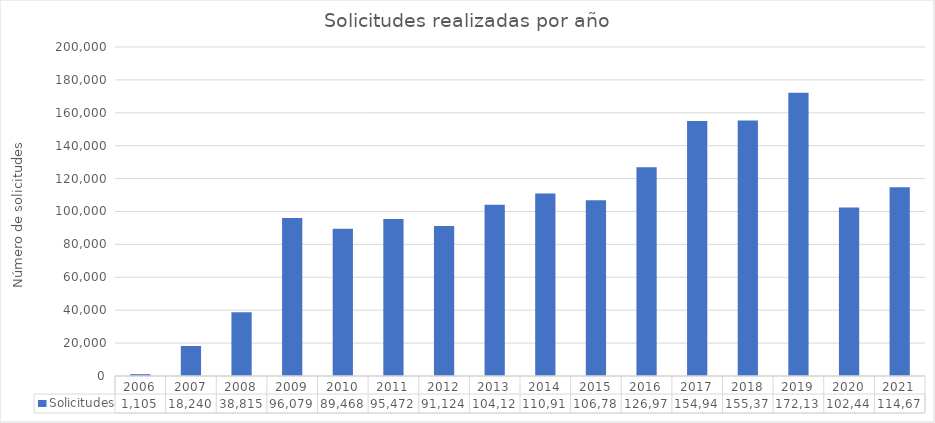
| Category | Solicitudes |
|---|---|
| 2006.0 | 1105 |
| 2007.0 | 18240 |
| 2008.0 | 38815 |
| 2009.0 | 96079 |
| 2010.0 | 89468 |
| 2011.0 | 95472 |
| 2012.0 | 91124 |
| 2013.0 | 104129 |
| 2014.0 | 110918 |
| 2015.0 | 106781 |
| 2016.0 | 126975 |
| 2017.0 | 154940 |
| 2018.0 | 155375 |
| 2019.0 | 172131 |
| 2020.0 | 102442 |
| 2021.0 | 114670 |